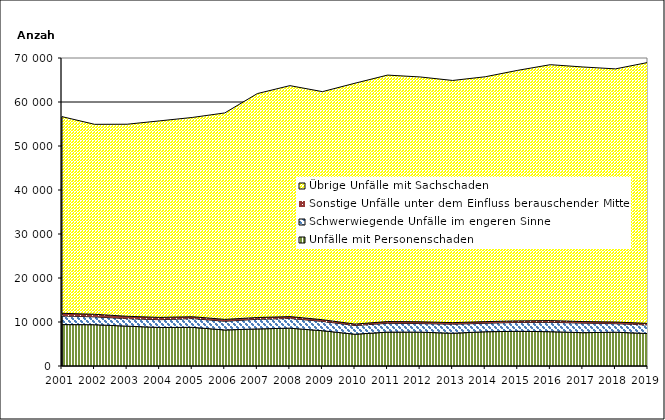
| Category | Unfälle mit Personenschaden | Schwerwiegende Unfälle im engeren Sinne | Sonstige Unfälle unter dem Einfluss berauschender Mittel 1) | Übrige Unfälle mit Sachschaden |
|---|---|---|---|---|
| 2001.0 | 9410 | 1972 | 596 | 44696 |
| 2002.0 | 9383 | 1782 | 592 | 43169 |
| 2003.0 | 9058 | 1702 | 542 | 43646 |
| 2004.0 | 8755 | 1770 | 513 | 44673 |
| 2005.0 | 8788 | 1991 | 422 | 45281 |
| 2006.0 | 8190 | 1977 | 424 | 46926 |
| 2007.0 | 8426 | 2186 | 404 | 50897 |
| 2008.0 | 8594 | 2206 | 432 | 52488 |
| 2009.0 | 8022 | 2115 | 380 | 51835 |
| 2010.0 | 7217 | 1987 | 324 | 54741 |
| 2011.0 | 7704 | 2003 | 394 | 56014 |
| 2012.0 | 7691 | 1958 | 401 | 55640 |
| 2013.0 | 7443 | 2059 | 355 | 55040 |
| 2014.0 | 7787 | 1921 | 380 | 55646 |
| 2015.0 | 7881 | 2030 | 341 | 56944 |
| 2016.0 | 7795 | 2138 | 392 | 58152 |
| 2017.0 | 7572 | 2169 | 356 | 57863 |
| 2018.0 | 7677 | 1941 | 377 | 57533 |
| 2019.0 | 7386 | 1946 | 351 | 59308 |